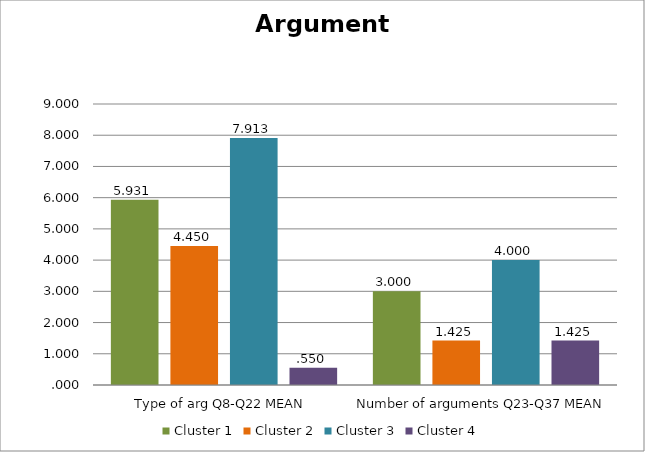
| Category | Cluster 1 | Cluster 2 | Cluster 3 | Cluster 4 |
|---|---|---|---|---|
| Type of arg Q8-Q22 MEAN | 5.931 | 4.45 | 7.912 | 0.55 |
| Number of arguments Q23-Q37 MEAN | 3 | 1.425 | 4 | 1.425 |